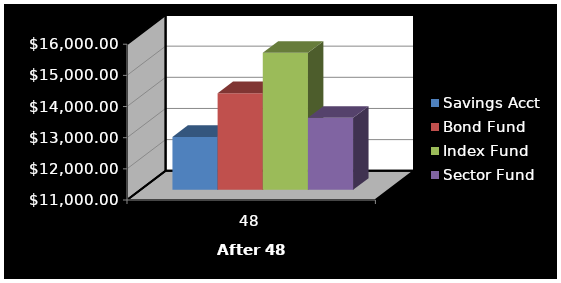
| Category | Savings Acct | Bond Fund | Index Fund | Sector Fund |
|---|---|---|---|---|
| 48.0 | 12695.46 | 14103.137 | 15396.632 | 13311.907 |